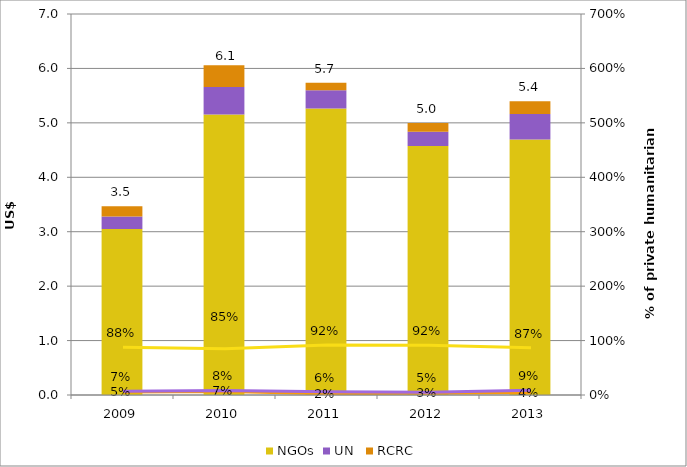
| Category | NGOs | UN  | RCRC |
|---|---|---|---|
| 2009.0 | 3.048 | 0.231 | 0.188 |
| 2010.0 | 5.152 | 0.507 | 0.4 |
| 2011.0 | 5.263 | 0.338 | 0.138 |
| 2012.0 | 4.574 | 0.261 | 0.162 |
| 2013.0 | 4.695 | 0.467 | 0.236 |